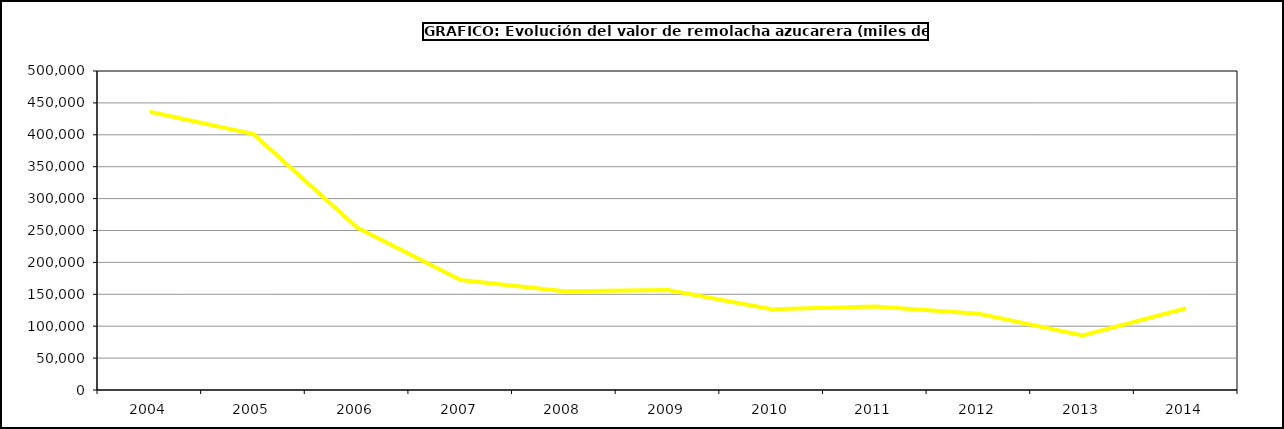
| Category | Valor |
|---|---|
| 2004.0 | 436236.474 |
| 2005.0 | 401010.06 |
| 2006.0 | 254641.255 |
| 2007.0 | 172339.526 |
| 2008.0 | 154723.398 |
| 2009.0 | 156763.564 |
| 2010.0 | 126535.709 |
| 2011.0 | 130682.292 |
| 2012.0 | 119377.935 |
| 2013.0 | 85662.388 |
| 2014.0 | 128081.83 |